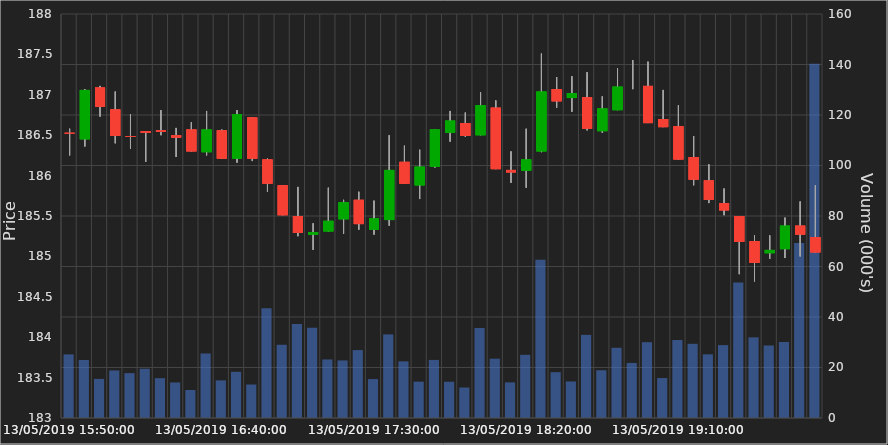
| Category | Series 0 |
|---|---|
| 13/05/2019 15:50:00 | 25186 |
| 13/05/2019 15:55:00 | 22967 |
| 13/05/2019 16:00:00 | 15481 |
| 13/05/2019 16:05:00 | 18829 |
| 13/05/2019 16:10:00 | 17771 |
| 13/05/2019 16:15:00 | 19514 |
| 13/05/2019 16:20:00 | 15777 |
| 13/05/2019 16:25:00 | 14072 |
| 13/05/2019 16:30:00 | 11085 |
| 13/05/2019 16:35:00 | 25547 |
| 13/05/2019 16:40:00 | 14895 |
| 13/05/2019 16:45:00 | 18290 |
| 13/05/2019 16:50:00 | 13261 |
| 13/05/2019 16:55:00 | 43442 |
| 13/05/2019 17:00:00 | 29002 |
| 13/05/2019 17:05:00 | 37241 |
| 13/05/2019 17:10:00 | 35725 |
| 13/05/2019 17:15:00 | 23187 |
| 13/05/2019 17:20:00 | 22800 |
| 13/05/2019 17:25:00 | 26903 |
| 13/05/2019 17:30:00 | 15418 |
| 13/05/2019 17:35:00 | 33105 |
| 13/05/2019 17:40:00 | 22442 |
| 13/05/2019 17:45:00 | 14391 |
| 13/05/2019 17:50:00 | 22991 |
| 13/05/2019 17:55:00 | 14343 |
| 13/05/2019 18:00:00 | 12064 |
| 13/05/2019 18:05:00 | 35616 |
| 13/05/2019 18:10:00 | 23493 |
| 13/05/2019 18:15:00 | 14104 |
| 13/05/2019 18:20:00 | 25014 |
| 13/05/2019 18:25:00 | 62672 |
| 13/05/2019 18:30:00 | 18144 |
| 13/05/2019 18:35:00 | 14466 |
| 13/05/2019 18:40:00 | 32917 |
| 13/05/2019 18:45:00 | 18916 |
| 13/05/2019 18:50:00 | 27801 |
| 13/05/2019 18:55:00 | 21803 |
| 13/05/2019 19:00:00 | 30032 |
| 13/05/2019 19:05:00 | 15829 |
| 13/05/2019 19:10:00 | 30877 |
| 13/05/2019 19:15:00 | 29378 |
| 13/05/2019 19:20:00 | 25208 |
| 13/05/2019 19:25:00 | 28872 |
| 13/05/2019 19:30:00 | 53656 |
| 13/05/2019 19:35:00 | 31929 |
| 13/05/2019 19:40:00 | 28718 |
| 13/05/2019 19:45:00 | 30093 |
| 13/05/2019 19:50:00 | 69276 |
| 13/05/2019 19:55:00 | 140264 |